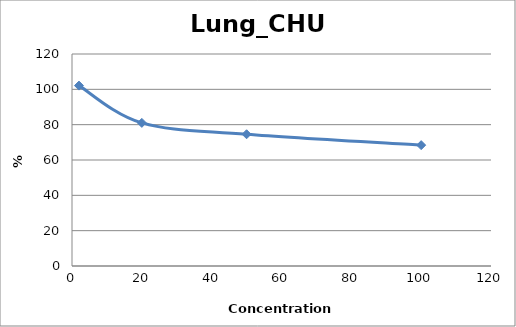
| Category | Lung_CHU2 |
|---|---|
| 100.0 | 68.407 |
| 50.0 | 74.572 |
| 20.0 | 81.008 |
| 2.0 | 102.115 |
| nan | 0 |
| nan | 0 |
| nan | 0 |
| nan | 0 |
| nan | 0 |